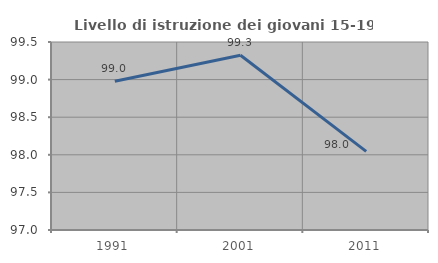
| Category | Livello di istruzione dei giovani 15-19 anni |
|---|---|
| 1991.0 | 98.977 |
| 2001.0 | 99.324 |
| 2011.0 | 98.046 |